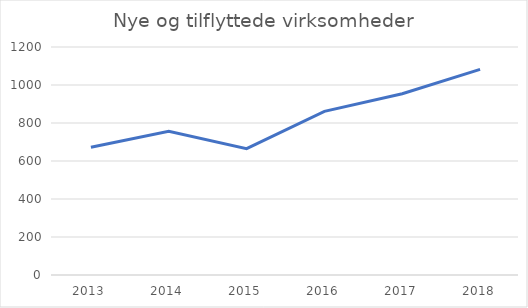
| Category | Nye virksomheder |
|---|---|
| 2013.0 | 672 |
| 2014.0 | 756 |
| 2015.0 | 665 |
| 2016.0 | 861 |
| 2017.0 | 954 |
| 2018.0 | 1082 |